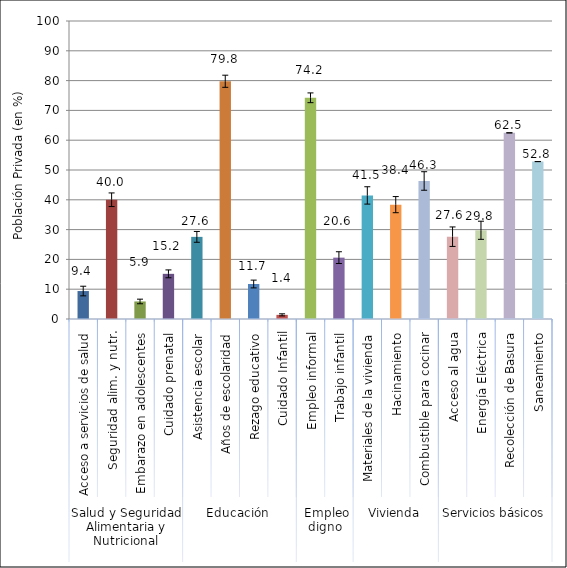
| Category | Series 0 |
|---|---|
| 0 | 9.384 |
| 1 | 40.019 |
| 2 | 5.886 |
| 3 | 15.154 |
| 4 | 27.56 |
| 5 | 79.781 |
| 6 | 11.742 |
| 7 | 1.383 |
| 8 | 74.234 |
| 9 | 20.594 |
| 10 | 41.47 |
| 11 | 38.376 |
| 12 | 46.317 |
| 13 | 27.623 |
| 14 | 29.774 |
| 15 | 62.465 |
| 16 | 52.826 |